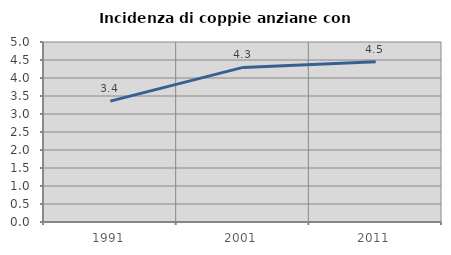
| Category | Incidenza di coppie anziane con figli |
|---|---|
| 1991.0 | 3.358 |
| 2001.0 | 4.295 |
| 2011.0 | 4.454 |